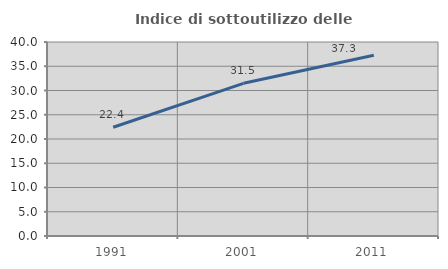
| Category | Indice di sottoutilizzo delle abitazioni  |
|---|---|
| 1991.0 | 22.422 |
| 2001.0 | 31.478 |
| 2011.0 | 37.258 |